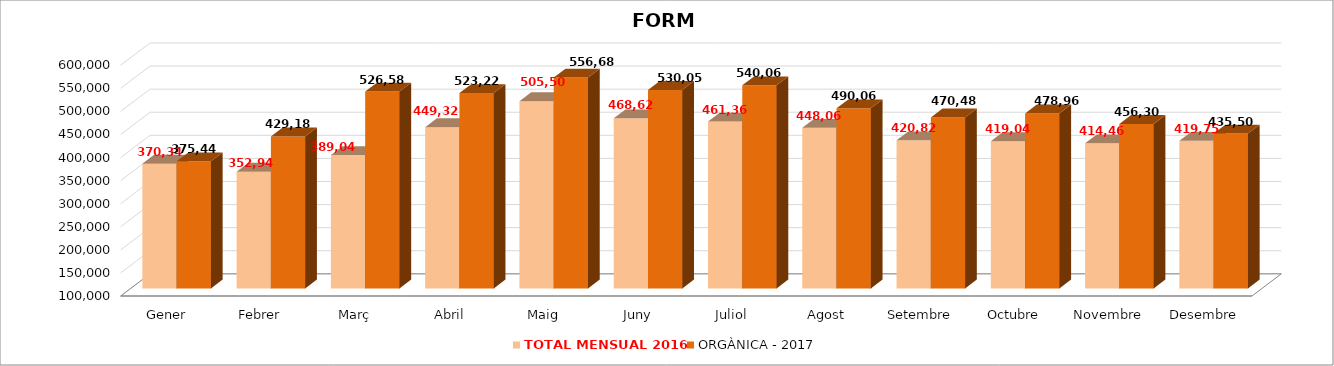
| Category | TOTAL MENSUAL 2016 | ORGÀNICA - 2017 |
|---|---|---|
| Gener | 370340 | 375440 |
| Febrer | 352940 | 429180 |
| Març | 389039.99 | 526579.5 |
| Abril | 449320.01 | 523220 |
| Maig | 505500 | 556680 |
| Juny | 468620 | 530059.36 |
| Juliol | 461360 | 540060 |
| Agost | 448059.99 | 490060 |
| Setembre | 420820 | 470480 |
| Octubre | 419040 | 478960 |
| Novembre | 414459.94 | 456300 |
| Desembre | 419750.01 | 435505 |